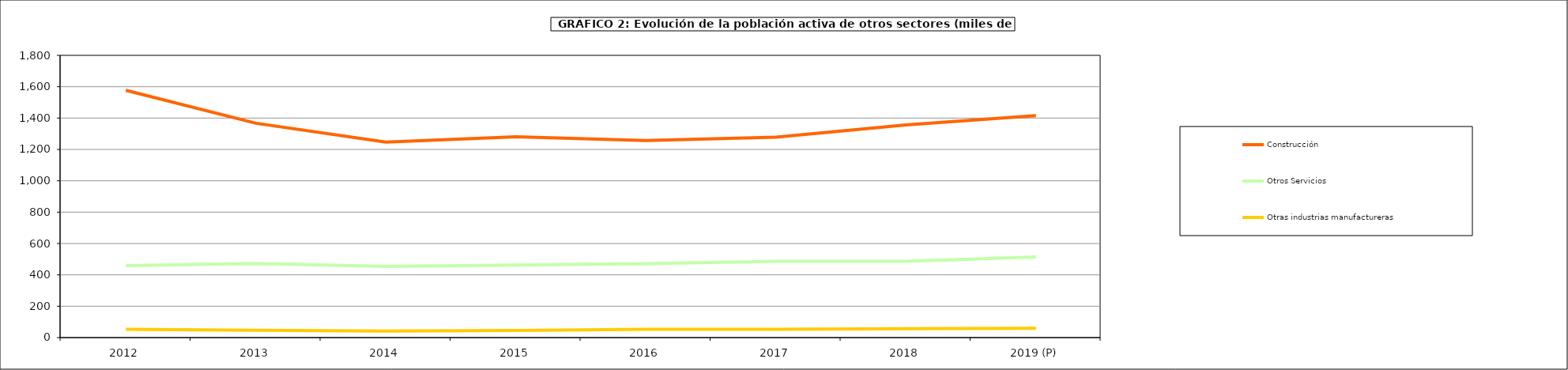
| Category | Construcción | Otros Servicios | Otras industrias manufactureras |
|---|---|---|---|
| 2012 | 1576.925 | 459.15 | 52.8 |
| 2013 | 1366.878 | 473.15 | 46.85 |
| 2014 | 1247.2 | 454.2 | 42.2 |
| 2015 | 1280.975 | 462.325 | 44.95 |
| 2016 | 1256.45 | 471.23 | 52.98 |
| 2017 | 1278.6 | 486.4 | 52.6 |
| 2018 | 1356.625 | 486.875 | 57 |
| 2019 (P) | 1415.25 | 513.675 | 59.45 |